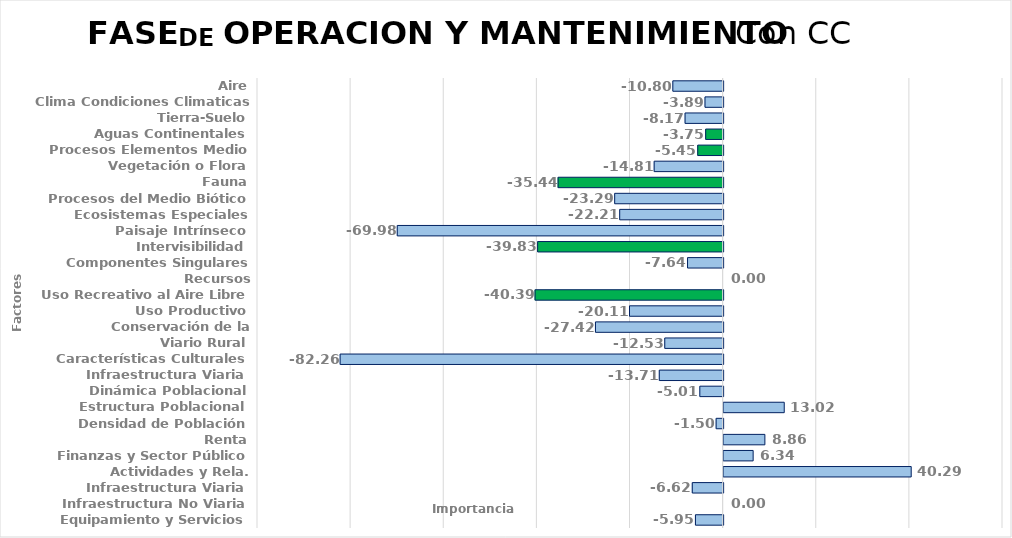
| Category | Series 0 |
|---|---|
| Aire | -10.799 |
| Clima Condiciones Climaticas | -3.891 |
| Tierra-Suelo | -8.172 |
| Aguas Continentales | -3.746 |
| Procesos Elementos Medio | -5.448 |
| Vegetación o Flora | -14.81 |
| Fauna | -35.442 |
| Procesos del Medio Biótico | -23.29 |
| Ecosistemas Especiales | -22.214 |
| Paisaje Intrínseco | -69.985 |
| Intervisibilidad | -39.834 |
| Componentes Singulares Paisaje | -7.644 |
| Recursos Científico-Culturales | 0 |
| Uso Recreativo al Aire Libre | -40.388 |
| Uso Productivo | -20.107 |
| Conservación de la Naturaleza | -27.418 |
| Viario Rural | -12.534 |
| Características Culturales | -82.255 |
| Infraestructura Viaria | -13.709 |
| Dinámica Poblacional | -5.007 |
| Estructura Poblacional | 13.017 |
| Densidad de Población | -1.502 |
| Renta | 8.86 |
| Finanzas y Sector Público | 6.342 |
| Actividades y Rela. Económicas | 40.288 |
| Infraestructura Viaria | -6.625 |
| Infraestructura No Viaria | 0 |
| Equipamiento y Servicios | -5.945 |